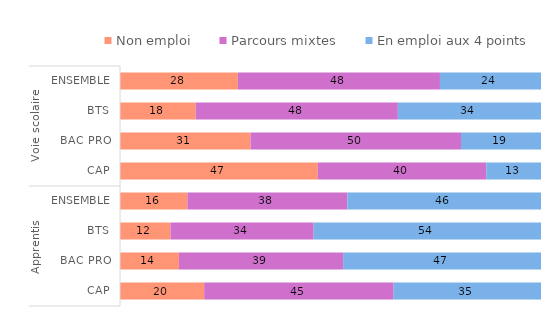
| Category | Non emploi | Parcours mixtes | En emploi aux 4 points |
|---|---|---|---|
| 0 | 20 | 45 | 35 |
| 1 | 14 | 39 | 47 |
| 2 | 12 | 34 | 54 |
| 3 | 16 | 38 | 46 |
| 4 | 47 | 40 | 13 |
| 5 | 31 | 50 | 19 |
| 6 | 18 | 48 | 34 |
| 7 | 28 | 48 | 24 |